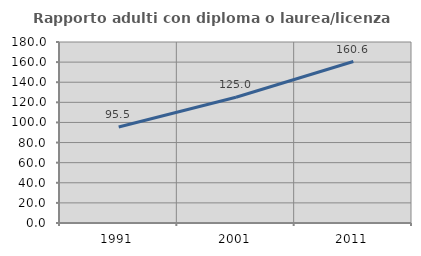
| Category | Rapporto adulti con diploma o laurea/licenza media  |
|---|---|
| 1991.0 | 95.455 |
| 2001.0 | 125 |
| 2011.0 | 160.606 |